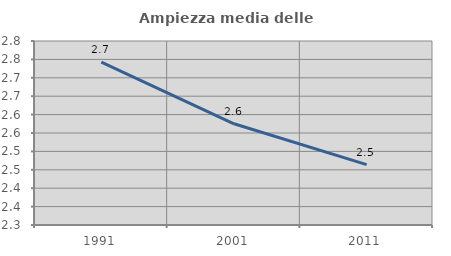
| Category | Ampiezza media delle famiglie |
|---|---|
| 1991.0 | 2.743 |
| 2001.0 | 2.575 |
| 2011.0 | 2.464 |